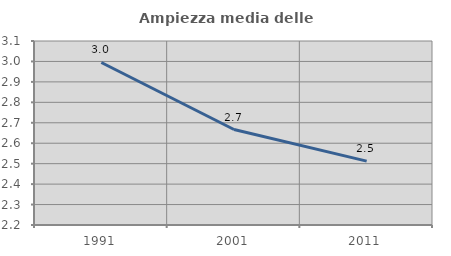
| Category | Ampiezza media delle famiglie |
|---|---|
| 1991.0 | 2.995 |
| 2001.0 | 2.667 |
| 2011.0 | 2.512 |